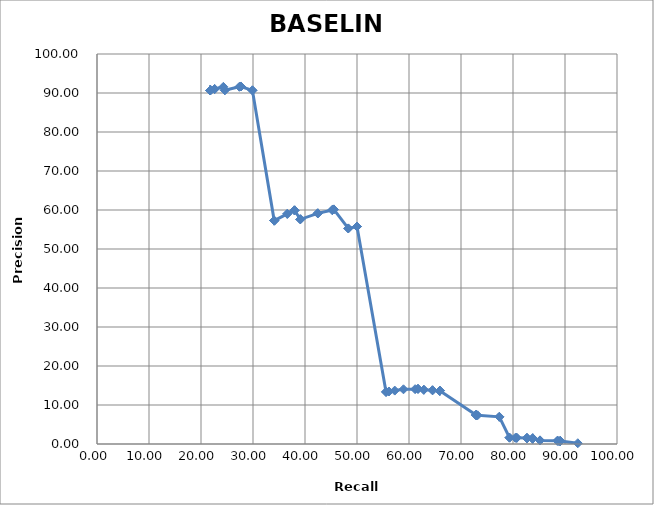
| Category | ALPS-1 |
|---|---|
| 21.788 | 90.698 |
| 21.788 | 90.698 |
| 21.788 | 90.698 |
| 21.788 | 90.698 |
| 21.788 | 90.698 |
| 21.788 | 90.698 |
| 21.788 | 90.698 |
| 21.788 | 90.698 |
| 21.788 | 90.698 |
| 21.788 | 90.698 |
| 21.788 | 90.698 |
| 21.788 | 90.698 |
| 21.788 | 90.698 |
| 21.788 | 90.698 |
| 22.626 | 91.011 |
| 22.626 | 91.011 |
| 24.302 | 91.579 |
| 24.581 | 90.722 |
| 24.581 | 90.722 |
| 27.374 | 91.589 |
| 27.654 | 91.667 |
| 27.654 | 91.667 |
| 27.654 | 91.667 |
| 29.888 | 90.678 |
| 29.888 | 90.678 |
| 34.078 | 57.277 |
| 34.078 | 57.277 |
| 34.078 | 57.277 |
| 34.078 | 57.277 |
| 36.592 | 59.009 |
| 36.592 | 59.009 |
| 37.989 | 59.912 |
| 37.989 | 59.912 |
| 37.989 | 59.912 |
| 39.106 | 57.613 |
| 39.106 | 57.613 |
| 39.106 | 57.613 |
| 42.458 | 59.144 |
| 42.458 | 59.144 |
| 42.458 | 59.144 |
| 45.251 | 60 |
| 45.251 | 60 |
| 45.251 | 60 |
| 45.531 | 60.148 |
| 45.531 | 60.148 |
| 48.324 | 55.272 |
| 48.324 | 55.272 |
| 50.0 | 55.763 |
| 50.0 | 55.763 |
| 50.0 | 55.763 |
| 55.587 | 13.347 |
| 55.587 | 13.347 |
| 56.145 | 13.463 |
| 57.263 | 13.694 |
| 58.939 | 14.029 |
| 61.173 | 14.056 |
| 61.732 | 14.139 |
| 61.732 | 14.139 |
| 62.849 | 13.906 |
| 62.849 | 13.906 |
| 64.525 | 13.775 |
| 64.525 | 13.775 |
| 65.922 | 13.65 |
| 65.922 | 13.65 |
| 65.922 | 13.65 |
| 65.922 | 13.65 |
| 65.922 | 13.65 |
| 72.905 | 7.436 |
| 72.905 | 7.436 |
| 72.905 | 7.436 |
| 72.905 | 7.436 |
| 72.905 | 7.436 |
| 73.184 | 7.362 |
| 77.374 | 6.97 |
| 77.374 | 6.97 |
| 79.33 | 1.623 |
| 79.33 | 1.623 |
| 80.447 | 1.587 |
| 80.726 | 1.589 |
| 80.726 | 1.589 |
| 82.682 | 1.51 |
| 82.682 | 1.51 |
| 82.682 | 1.51 |
| 82.682 | 1.51 |
| 83.799 | 1.482 |
| 83.799 | 1.481 |
| 83.799 | 1.345 |
| 83.799 | 1.345 |
| 83.799 | 1.344 |
| 85.196 | 0.918 |
| 85.196 | 0.918 |
| 88.547 | 0.824 |
| 88.547 | 0.824 |
| 88.827 | 0.751 |
| 89.106 | 0.738 |
| 89.106 | 0.737 |
| 89.106 | 0.737 |
| 89.106 | 0.737 |
| 89.106 | 0.737 |
| 89.106 | 0.737 |
| 92.458 | 0.195 |